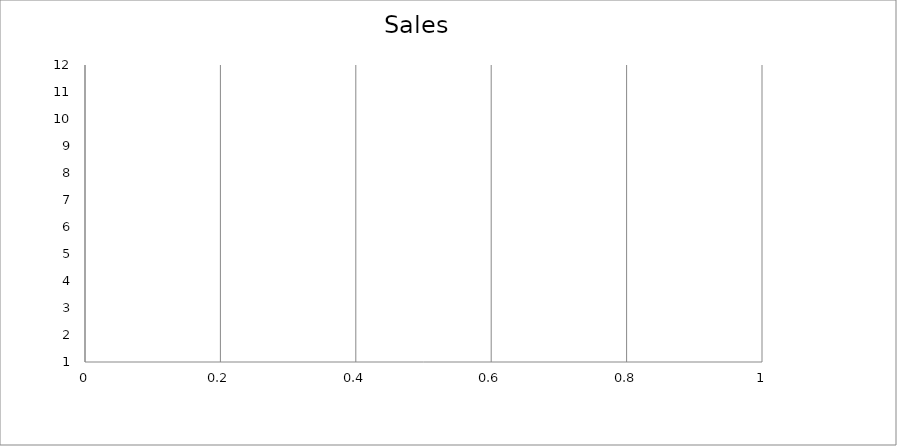
| Category | Actual |
|---|---|
| 0 | 1170 |
| 1 | 650 |
| 2 | 3010 |
| 3 | 1820 |
| 4 | 690 |
| 5 | 1600 |
| 6 | 1730 |
| 7 | 1890 |
| 8 | 2490 |
| 9 | 560 |
| 10 | 2240 |
| 11 | 600 |